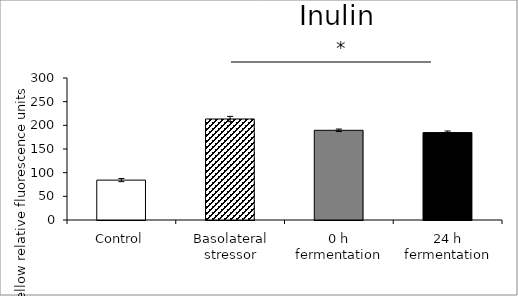
| Category | average |
|---|---|
| Control | 84.262 |
| Basolateral stressor | 213.4 |
| 0 h fermentation | 189.522 |
| 24 h fermentation | 184.687 |